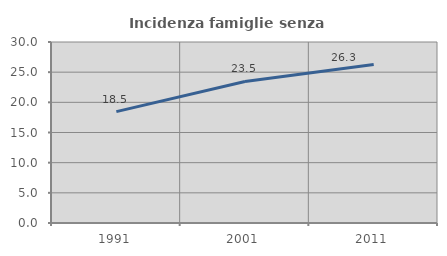
| Category | Incidenza famiglie senza nuclei |
|---|---|
| 1991.0 | 18.458 |
| 2001.0 | 23.459 |
| 2011.0 | 26.279 |